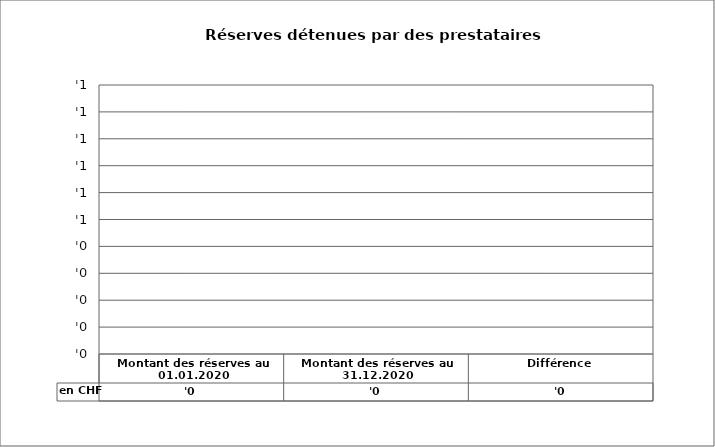
| Category | en CHF |
|---|---|
| Montant des réserves au 01.01.2020 | 0 |
| Montant des réserves au 31.12.2020 | 0 |
| Différence | 0 |